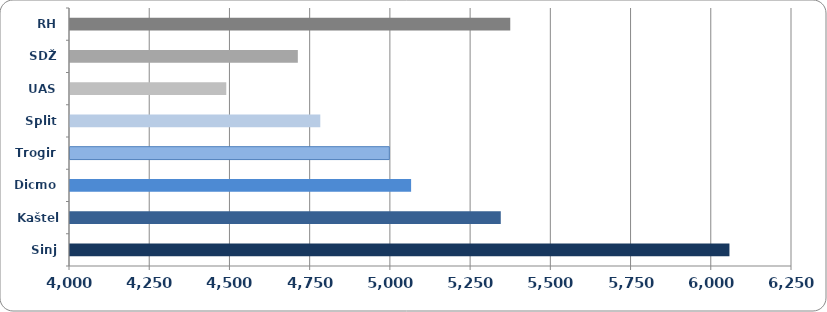
| Category | Prosječna mjesečna neto plaća |
|---|---|
| Sinj | 6055.048 |
| Kaštela | 5342.429 |
| Dicmo | 5063.01 |
| Trogir | 4995.103 |
| Split | 4779.99 |
| UAS | 4487 |
| SDŽ | 4710 |
| RH | 5372 |